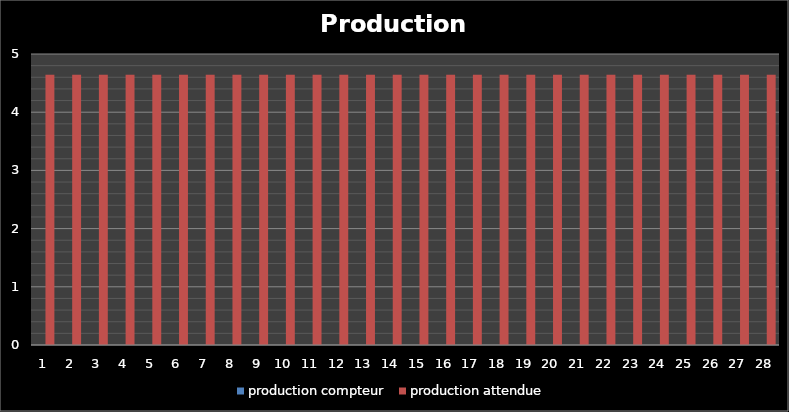
| Category | production compteur | production attendue |
|---|---|---|
| 1.0 | 0 | 4.643 |
| 2.0 | 0 | 4.643 |
| 3.0 | 0 | 4.643 |
| 4.0 | 0 | 4.643 |
| 5.0 | 0 | 4.643 |
| 6.0 | 0 | 4.643 |
| 7.0 | 0 | 4.643 |
| 8.0 | 0 | 4.643 |
| 9.0 | 0 | 4.643 |
| 10.0 | 0 | 4.643 |
| 11.0 | 0 | 4.643 |
| 12.0 | 0 | 4.643 |
| 13.0 | 0 | 4.643 |
| 14.0 | 0 | 4.643 |
| 15.0 | 0 | 4.643 |
| 16.0 | 0 | 4.643 |
| 17.0 | 0 | 4.643 |
| 18.0 | 0 | 4.643 |
| 19.0 | 0 | 4.643 |
| 20.0 | 0 | 4.643 |
| 21.0 | 0 | 4.643 |
| 22.0 | 0 | 4.643 |
| 23.0 | 0 | 4.643 |
| 24.0 | 0 | 4.643 |
| 25.0 | 0 | 4.643 |
| 26.0 | 0 | 4.643 |
| 27.0 | 0 | 4.643 |
| 28.0 | 0 | 4.643 |